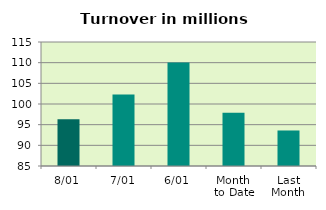
| Category | Series 0 |
|---|---|
| 8/01 | 96.299 |
| 7/01 | 102.306 |
| 6/01 | 110.032 |
| Month 
to Date | 97.859 |
| Last
Month | 93.592 |